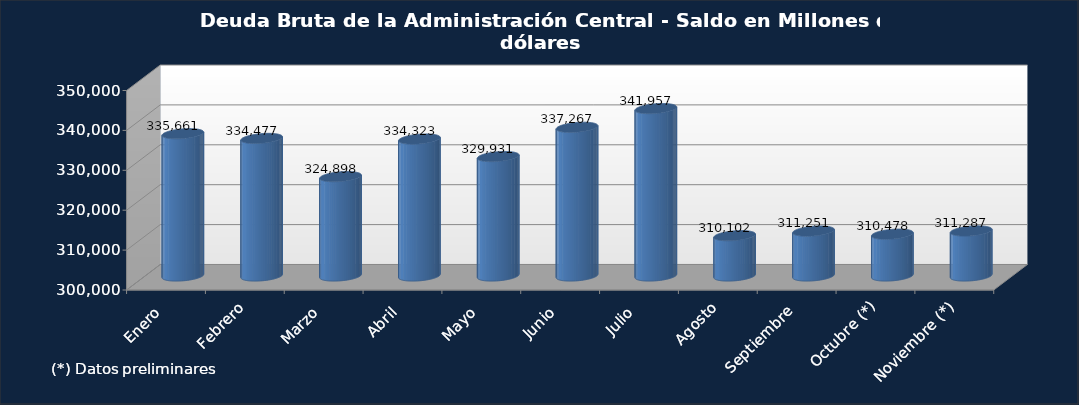
| Category | Series 0 |
|---|---|
| Enero  | 335661.4 |
| Febrero | 334476.9 |
| Marzo | 324898 |
| Abril | 334322.8 |
| Mayo | 329931 |
| Junio | 337267.1 |
| Julio | 341957.1 |
| Agosto | 310101.7 |
| Septiembre | 311251.1 |
| Octubre (*) | 310478.4 |
| Noviembre (*) | 311286.6 |